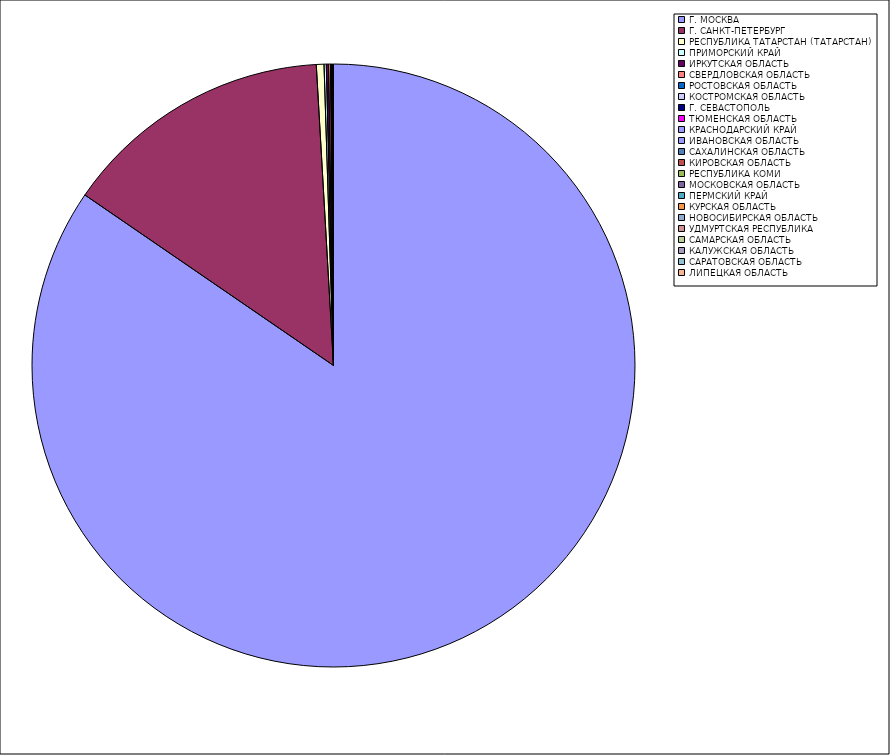
| Category | Оборот |
|---|---|
| Г. МОСКВА | 84.563 |
| Г. САНКТ-ПЕТЕРБУРГ | 14.52 |
| РЕСПУБЛИКА ТАТАРСТАН (ТАТАРСТАН) | 0.41 |
| ПРИМОРСКИЙ КРАЙ | 0.12 |
| ИРКУТСКАЯ ОБЛАСТЬ | 0.119 |
| СВЕРДЛОВСКАЯ ОБЛАСТЬ | 0.105 |
| РОСТОВСКАЯ ОБЛАСТЬ | 0.031 |
| КОСТРОМСКАЯ ОБЛАСТЬ | 0.027 |
| Г. СЕВАСТОПОЛЬ | 0.022 |
| ТЮМЕНСКАЯ ОБЛАСТЬ | 0.022 |
| КРАСНОДАРСКИЙ КРАЙ | 0.011 |
| ИВАНОВСКАЯ ОБЛАСТЬ | 0.008 |
| САХАЛИНСКАЯ ОБЛАСТЬ | 0.006 |
| КИРОВСКАЯ ОБЛАСТЬ | 0.005 |
| РЕСПУБЛИКА КОМИ | 0.004 |
| МОСКОВСКАЯ ОБЛАСТЬ | 0.004 |
| ПЕРМСКИЙ КРАЙ | 0.003 |
| КУРСКАЯ ОБЛАСТЬ | 0.003 |
| НОВОСИБИРСКАЯ ОБЛАСТЬ | 0.002 |
| УДМУРТСКАЯ РЕСПУБЛИКА | 0.002 |
| САМАРСКАЯ ОБЛАСТЬ | 0.002 |
| КАЛУЖСКАЯ ОБЛАСТЬ | 0.002 |
| САРАТОВСКАЯ ОБЛАСТЬ | 0.002 |
| ЛИПЕЦКАЯ ОБЛАСТЬ | 0.001 |